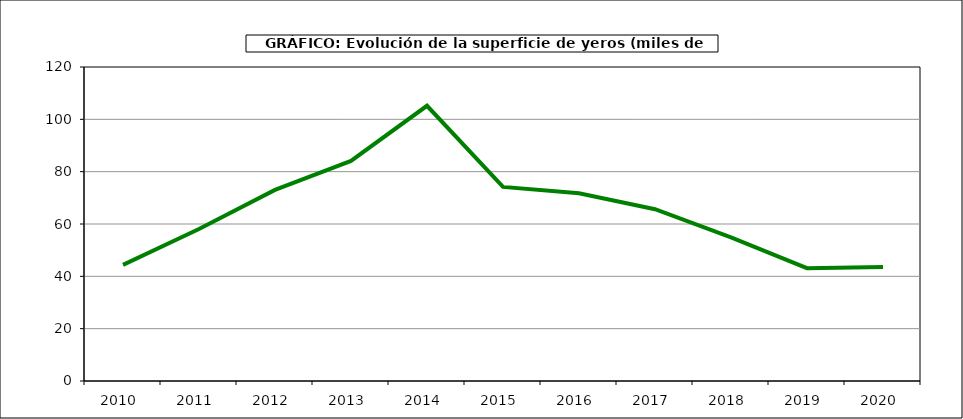
| Category | Superficie |
|---|---|
| 2010.0 | 44.369 |
| 2011.0 | 58.104 |
| 2012.0 | 73.051 |
| 2013.0 | 84.103 |
| 2014.0 | 105.185 |
| 2015.0 | 74.162 |
| 2016.0 | 71.777 |
| 2017.0 | 65.659 |
| 2018.0 | 54.885 |
| 2019.0 | 43.102 |
| 2020.0 | 43.561 |